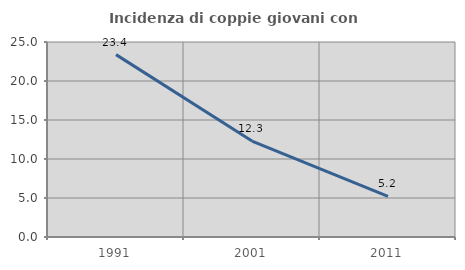
| Category | Incidenza di coppie giovani con figli |
|---|---|
| 1991.0 | 23.382 |
| 2001.0 | 12.301 |
| 2011.0 | 5.21 |